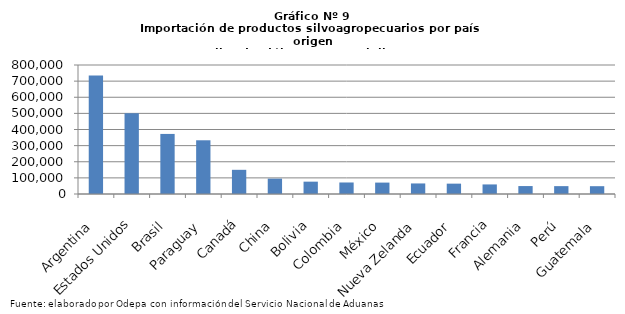
| Category | Series 0 |
|---|---|
| Argentina | 734289.284 |
| Estados Unidos | 500296.704 |
| Brasil | 372536.517 |
| Paraguay | 333144.415 |
| Canadá | 149936.47 |
| China | 95265.843 |
| Bolivia | 76532.838 |
| Colombia | 71449.811 |
| México | 70708.258 |
| Nueva Zelanda | 65468.581 |
| Ecuador | 64210.355 |
| Francia | 59362.387 |
| Alemania | 49228.305 |
| Perú | 48795.261 |
| Guatemala | 48425.712 |